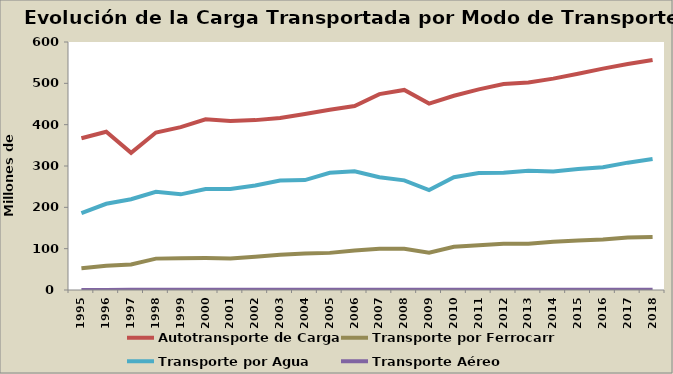
| Category | Autotransporte de Carga | Transporte por Ferrocarril | Transporte por Agua | Transporte Aéreo |
|---|---|---|---|---|
| 1995.0 | 367 | 52.48 | 186.26 | 0.252 |
| 1996.0 | 383 | 58.831 | 208.581 | 0.285 |
| 1997.0 | 332 | 61.666 | 219.653 | 0.335 |
| 1998.0 | 381 | 75.914 | 237.38 | 0.388 |
| 1999.0 | 394 | 77.062 | 231.44 | 0.407 |
| 2000.0 | 413 | 77.164 | 244.252 | 0.379 |
| 2001.0 | 409 | 76.182 | 244.431 | 0.351 |
| 2002.0 | 411 | 80.451 | 253.046 | 0.389 |
| 2003.0 | 416 | 85.168 | 264.739 | 0.41 |
| 2004.0 | 426 | 88.097 | 266.008 | 0.467 |
| 2005.0 | 436 | 89.814 | 283.604 | 0.529 |
| 2006.0 | 445 | 95.713 | 287.432 | 0.544 |
| 2007.0 | 474 | 99.845 | 272.934 | 0.572 |
| 2008.0 | 484 | 99.692 | 265.237 | 0.525 |
| 2009.0 | 451 | 90.321 | 241.923 | 0.466 |
| 2010.0 | 470 | 104.564 | 272.811 | 0.571 |
| 2011.0 | 485.502 | 108.433 | 282.902 | 0.562 |
| 2012.0 | 498.147 | 111.607 | 283.462 | 0.559 |
| 2013.0 | 502.15 | 111.933 | 288.696 | 0.582 |
| 2014.0 | 511.34 | 116.936 | 286.761 | 0.618 |
| 2015.0 | 522.99 | 119.646 | 292.646 | 0.655 |
| 2016.0 | 535.548 | 121.968 | 297.199 | 0.685 |
| 2017.0 | 546.588 | 126.875 | 308.089 | 0.74 |
| 2018.0 | 556.411 | 128.038 | 317.013 | 0.83 |